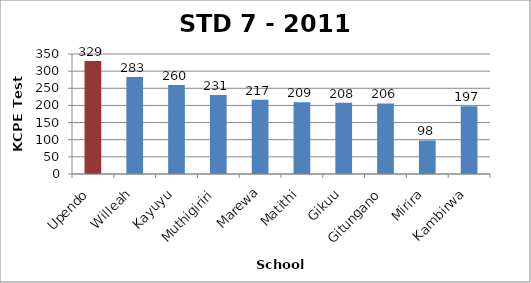
| Category | STD 7 Total Score |
|---|---|
| Upendo | 329.43 |
| Willeah | 283.22 |
| Kayuyu | 259.64 |
| Muthigiriri | 230.52 |
| Marewa | 216.53 |
| Matithi | 209.38 |
| Gikuu | 207.69 |
| Gitungano | 205.63 |
| Mirira | 97.84 |
| Kambirwa | 197.31 |